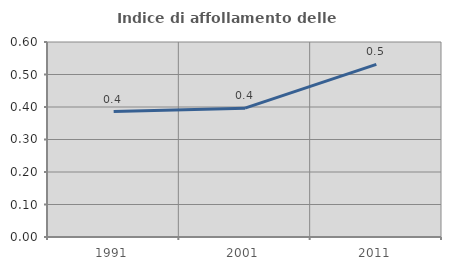
| Category | Indice di affollamento delle abitazioni  |
|---|---|
| 1991.0 | 0.386 |
| 2001.0 | 0.397 |
| 2011.0 | 0.531 |